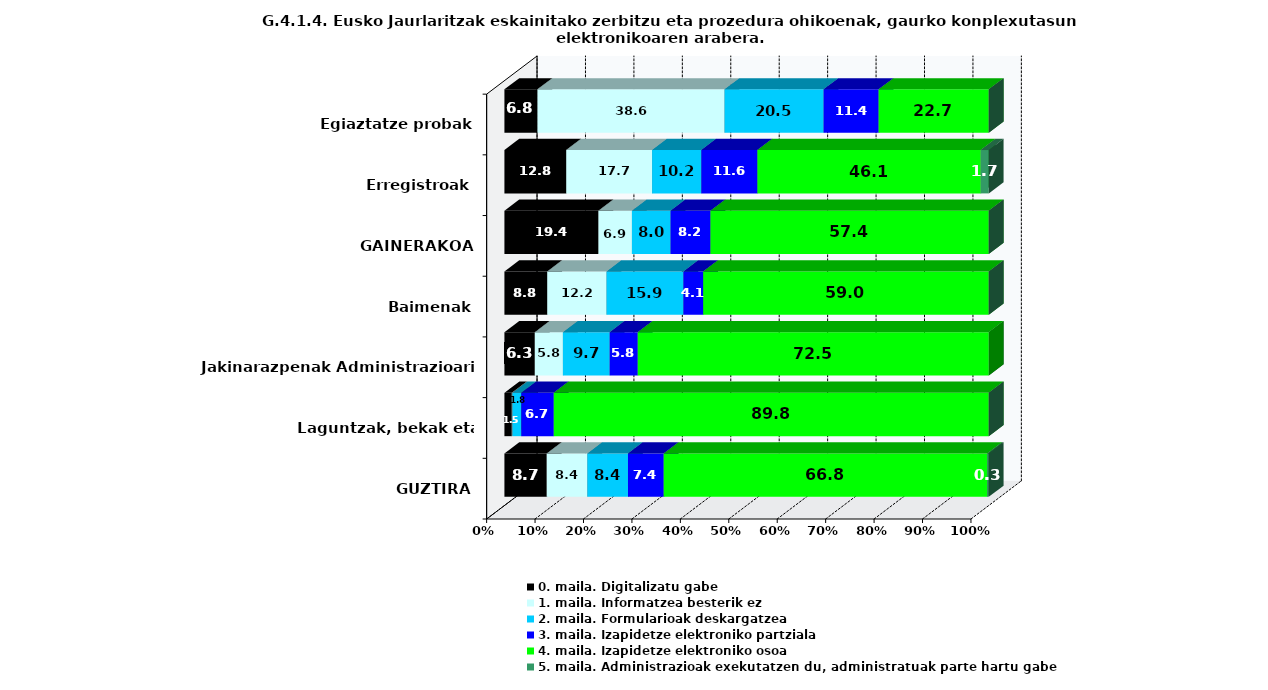
| Category | 0. maila. Digitalizatu gabe | 1. maila. Informatzea besterik ez | 2. maila. Formularioak deskargatzea | 3. maila. Izapidetze elektroniko partziala | 4. maila. Izapidetze elektroniko osoa | 5. maila. Administrazioak exekutatzen du, administratuak parte hartu gabe |
|---|---|---|---|---|---|---|
| GUZTIRA | 8.745 | 8.382 | 8.382 | 7.386 | 66.787 | 0.317 |
| Laguntzak, bekak eta diru-laguntzak | 1.536 | 0.14 | 1.816 | 6.704 | 89.804 | 0 |
| Jakinarazpenak Administrazioari | 6.28 | 5.797 | 9.662 | 5.797 | 72.464 | 0 |
| Baimenak | 8.844 | 12.245 | 15.873 | 4.082 | 58.957 | 0 |
| GAINERAKOA | 19.415 | 6.915 | 7.979 | 8.245 | 57.447 | 0 |
| Erregistroak | 12.766 | 17.73 | 10.165 | 11.584 | 46.099 | 1.655 |
| Egiaztatze probak | 6.818 | 38.636 | 20.455 | 11.364 | 22.727 | 0 |